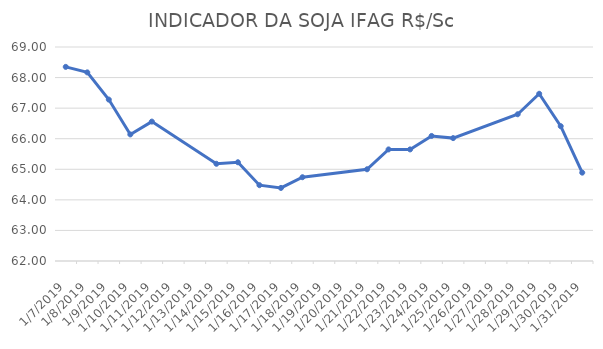
| Category | INDICADOR DA SOJA IFAG |
|---|---|
| 1/7/19 | 68.35 |
| 1/8/19 | 68.17 |
| 1/9/19 | 67.28 |
| 1/10/19 | 66.14 |
| 1/11/19 | 66.56 |
| 1/14/19 | 65.18 |
| 1/15/19 | 65.23 |
| 1/16/19 | 64.48 |
| 1/17/19 | 64.39 |
| 1/18/19 | 64.74 |
| 1/21/19 | 65 |
| 1/22/19 | 65.65 |
| 1/23/19 | 65.65 |
| 1/24/19 | 66.09 |
| 1/25/19 | 66.02 |
| 1/28/19 | 66.8 |
| 1/29/19 | 67.47 |
| 1/30/19 | 66.41 |
| 1/31/19 | 64.89 |